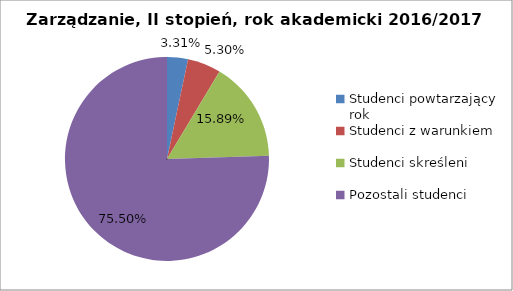
| Category | Series 0 |
|---|---|
| Studenci powtarzający rok | 10 |
| Studenci z warunkiem | 16 |
| Studenci skreśleni | 48 |
| Pozostali studenci | 228 |